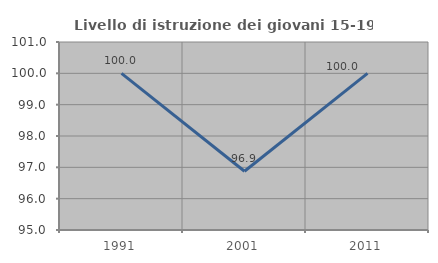
| Category | Livello di istruzione dei giovani 15-19 anni |
|---|---|
| 1991.0 | 100 |
| 2001.0 | 96.875 |
| 2011.0 | 100 |